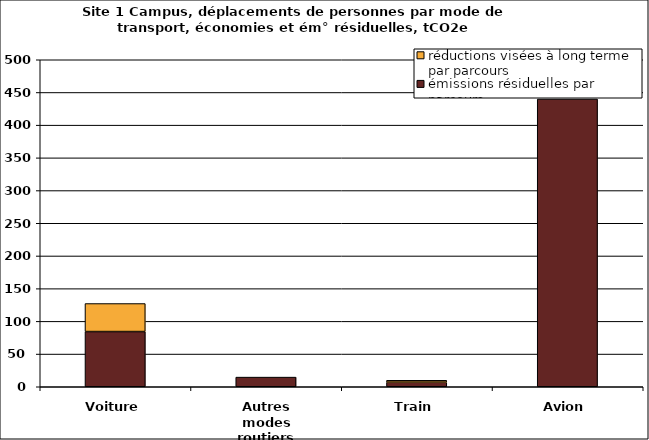
| Category | émissions résiduelles par parcours | réductions visées à long terme par parcours |
|---|---|---|
| Voiture | 84.402 | 42.863 |
| Autres modes routiers | 14.742 | 0 |
| Train | 7.038 | 2.868 |
| Avion | 439.94 | 0 |